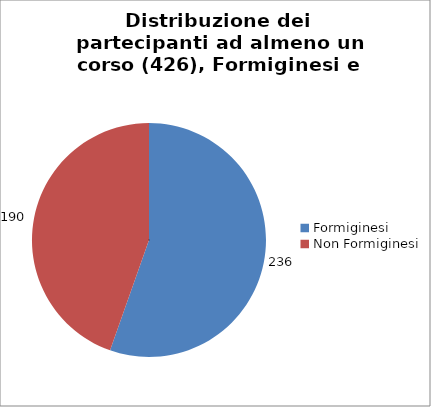
| Category | Nr. Tesserati |
|---|---|
| Formiginesi | 236 |
| Non Formiginesi | 190 |